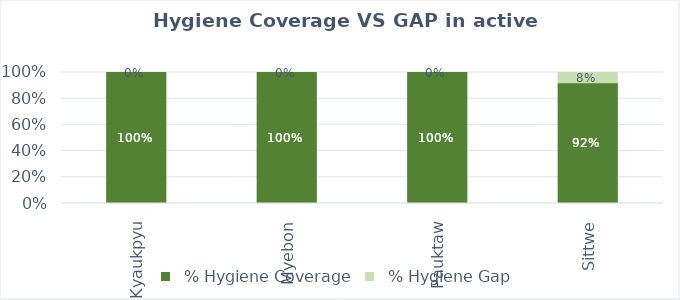
| Category |   % Hygiene Coverage |   % Hygiene Gap |
|---|---|---|
| Kyaukpyu | 1 | 0 |
| Myebon | 1 | 0 |
| Pauktaw | 1 | 0 |
| Sittwe | 0.922 | 0.078 |